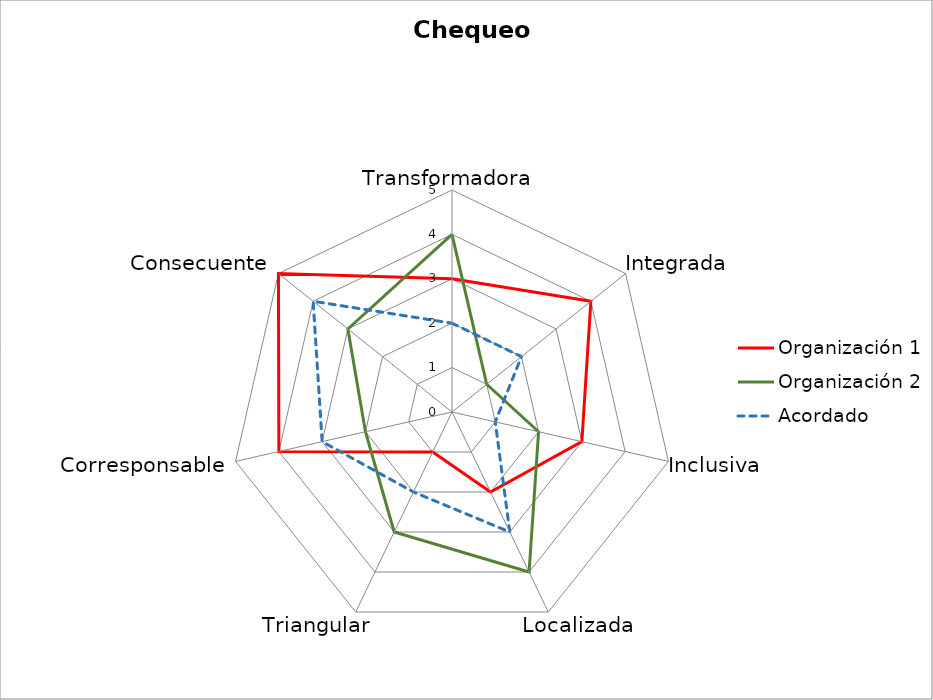
| Category | Organización 1 | Organización 2 | Acordado |
|---|---|---|---|
| Transformadora | 3 | 4 | 2 |
| Integrada | 4 | 1 | 2 |
| Inclusiva | 3 | 2 | 1 |
| Localizada | 2 | 4 | 3 |
| Triangular | 1 | 3 | 2 |
| Corresponsable | 4 | 2 | 3 |
| Consecuente | 5 | 3 | 4 |